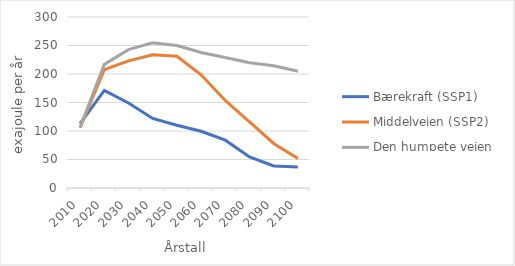
| Category | Bærekraft (SSP1) | Middelveien (SSP2) | Den humpete veien (SSP3) |
|---|---|---|---|
| 2010.0 | 112.796 | 105.706 | 106.729 |
| 2020.0 | 171.153 | 207.589 | 216.916 |
| 2030.0 | 149.204 | 222.998 | 242.753 |
| 2040.0 | 122.015 | 233.557 | 254.729 |
| 2050.0 | 110.056 | 231.061 | 249.896 |
| 2060.0 | 99.495 | 198.697 | 237.715 |
| 2070.0 | 83.873 | 153.481 | 228.87 |
| 2080.0 | 54.576 | 115.849 | 219.592 |
| 2090.0 | 38.571 | 78.167 | 214.428 |
| 2100.0 | 36.878 | 51.653 | 204.843 |